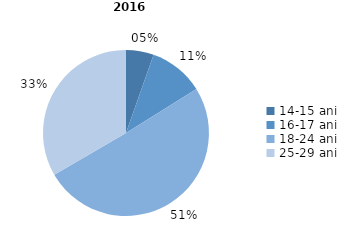
| Category | Series 0 |
|---|---|
| 14-15 ani | 5.4 |
| 16-17 ani | 10.7 |
| 18-24 ani | 50.5 |
| 25-29 ani | 33.4 |